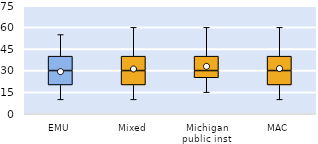
| Category | 25th | 50th | 75th |
|---|---|---|---|
| EMU | 20 | 10 | 10 |
| Mixed | 20 | 10 | 10 |
| Michigan public inst | 25 | 5 | 10 |
| MAC | 20 | 10 | 10 |